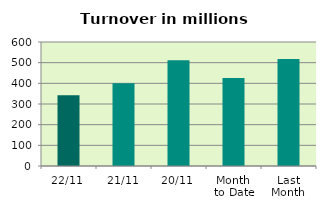
| Category | Series 0 |
|---|---|
| 22/11 | 342.086 |
| 21/11 | 400.763 |
| 20/11 | 511.774 |
| Month 
to Date | 425.786 |
| Last
Month | 517.71 |